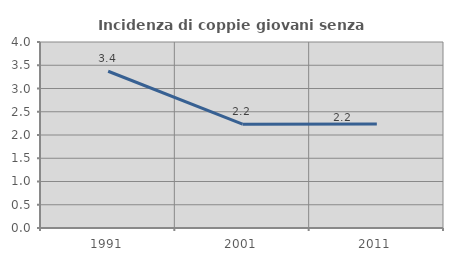
| Category | Incidenza di coppie giovani senza figli |
|---|---|
| 1991.0 | 3.371 |
| 2001.0 | 2.233 |
| 2011.0 | 2.235 |